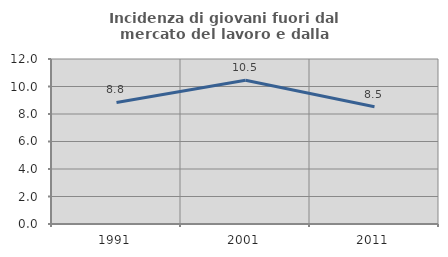
| Category | Incidenza di giovani fuori dal mercato del lavoro e dalla formazione  |
|---|---|
| 1991.0 | 8.837 |
| 2001.0 | 10.458 |
| 2011.0 | 8.527 |